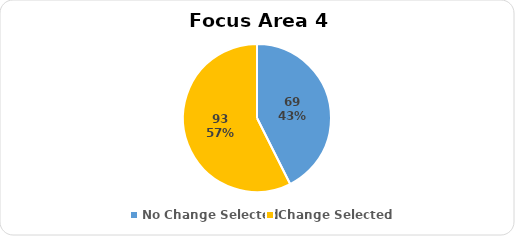
| Category | Series 0 |
|---|---|
| No Change Selected | 69 |
| Change Selected | 93 |